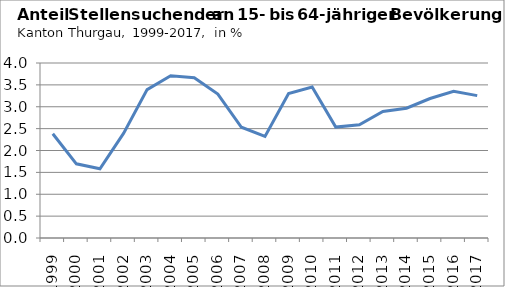
| Category | Anteil an 15- bis 64-jähriger Bevölkerung
in % |
|---|---|
| 1999.0 | 2.384 |
| 2000.0 | 1.696 |
| 2001.0 | 1.582 |
| 2002.0 | 2.392 |
| 2003.0 | 3.392 |
| 2004.0 | 3.709 |
| 2005.0 | 3.665 |
| 2006.0 | 3.288 |
| 2007.0 | 2.532 |
| 2008.0 | 2.321 |
| 2009.0 | 3.3 |
| 2010.0 | 3.453 |
| 2011.0 | 2.535 |
| 2012.0 | 2.589 |
| 2013.0 | 2.892 |
| 2014.0 | 2.966 |
| 2015.0 | 3.188 |
| 2016.0 | 3.355 |
| 2017.0 | 3.254 |